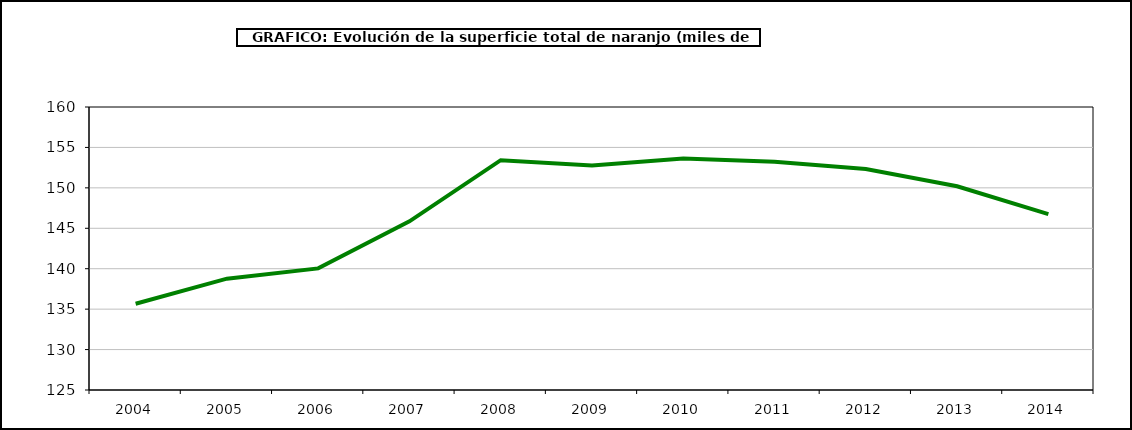
| Category | superficie |
|---|---|
| 2004.0 | 135.668 |
| 2005.0 | 138.769 |
| 2006.0 | 140.039 |
| 2007.0 | 145.856 |
| 2008.0 | 153.42 |
| 2009.0 | 152.776 |
| 2010.0 | 153.631 |
| 2011.0 | 153.222 |
| 2012.0 | 152.34 |
| 2013.0 | 150.198 |
| 2014.0 | 146.742 |